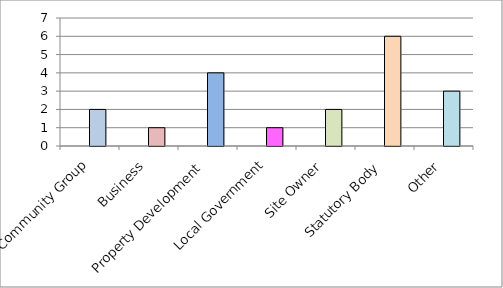
| Category | Series 0 | Total |
|---|---|---|
| Community Group |  | 2 |
| Business |  | 1 |
| Property Development |  | 4 |
| Local Government |  | 1 |
| Site Owner |  | 2 |
| Statutory Body |  | 6 |
| Other |  | 3 |